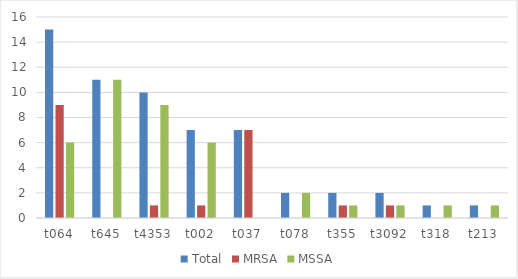
| Category | Total | MRSA | MSSA |
|---|---|---|---|
| t064 | 15 | 9 | 6 |
| t645 | 11 | 0 | 11 |
| t4353 | 10 | 1 | 9 |
| t002 | 7 | 1 | 6 |
| t037 | 7 | 7 | 0 |
| t078 | 2 | 0 | 2 |
| t355 | 2 | 1 | 1 |
| t3092 | 2 | 1 | 1 |
| t318 | 1 | 0 | 1 |
| t213 | 1 | 0 | 1 |